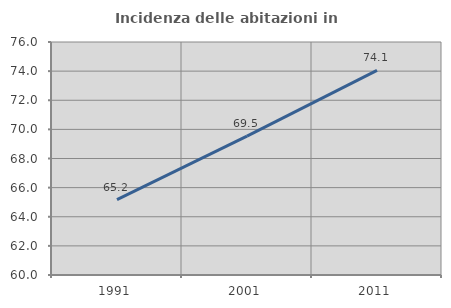
| Category | Incidenza delle abitazioni in proprietà  |
|---|---|
| 1991.0 | 65.181 |
| 2001.0 | 69.542 |
| 2011.0 | 74.055 |